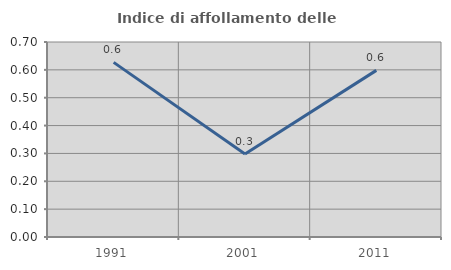
| Category | Indice di affollamento delle abitazioni  |
|---|---|
| 1991.0 | 0.627 |
| 2001.0 | 0.298 |
| 2011.0 | 0.598 |